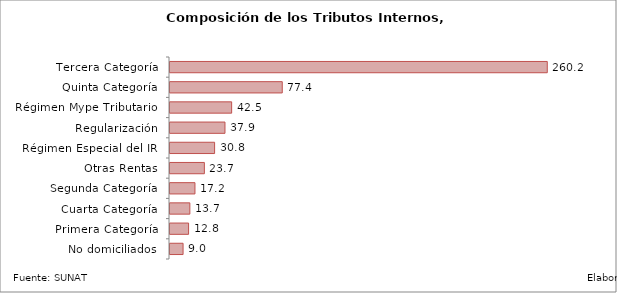
| Category | Series 0 | Series 1 | Series 2 |
|---|---|---|---|
|    Tercera Categoría |  |  | 260.192 |
|    Quinta Categoría |  |  | 77.415 |
|    Régimen Mype Tributario |  |  | 42.513 |
|    Regularización |  |  | 37.919 |
|    Régimen Especial del IR |  |  | 30.755 |
|    Otras Rentas |  |  | 23.699 |
|    Segunda Categoría |  |  | 17.212 |
|    Cuarta Categoría |  |  | 13.689 |
|    Primera Categoría |  |  | 12.814 |
|    No domiciliados |  |  | 9.012 |